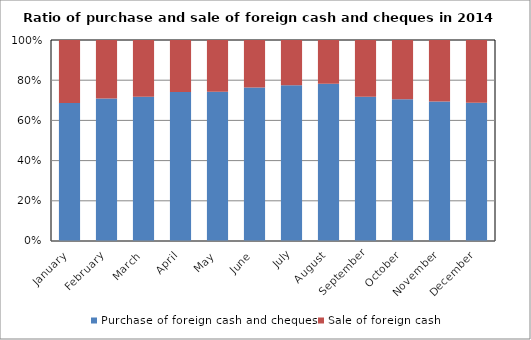
| Category | Purchase of foreign cash and cheques  | Sale of foreign cash |
|---|---|---|
| January | 1040070691 | 476159841 |
| February | 1036227628 | 425763152 |
| March | 1308589595 | 516029908 |
| April | 1669573550 | 584338023 |
| May | 1696921504 | 588560654 |
| June | 2156203590 | 665040964 |
| July | 2893972766 | 840841413 |
| August | 3580994073 | 994839010 |
| September | 1892170019 | 744555815 |
| October | 1609142445 | 674389010 |
| November | 1174047275 | 516877820 |
| December | 1439103080 | 654985922 |